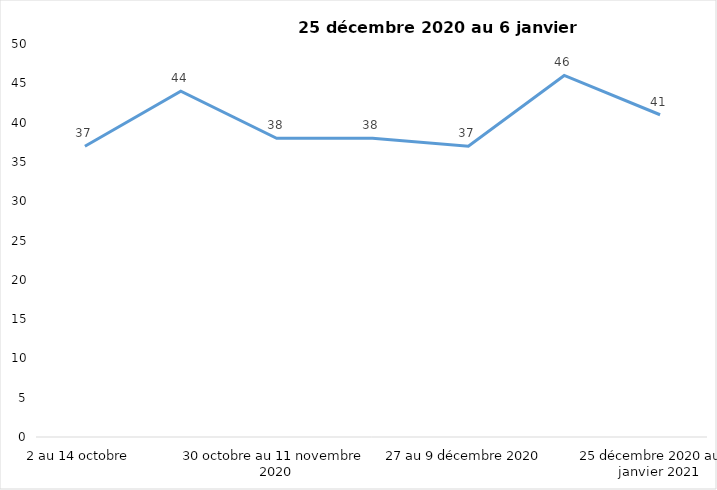
| Category | Toujours aux trois mesures |
|---|---|
| 2 au 14 octobre  | 37 |
| 16 au 28 octobre 2020 | 44 |
| 30 octobre au 11 novembre 2020 | 38 |
| 13 au 25 novembre 2020 | 38 |
| 27 au 9 décembre 2020 | 37 |
| 11 au 25 décembre 2020 | 46 |
| 25 décembre 2020 au 6 janvier 2021 | 41 |